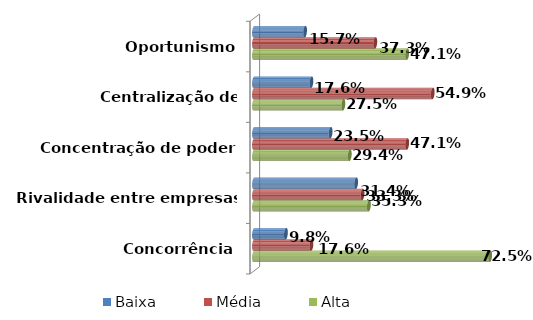
| Category | Baixa | Média | Alta |
|---|---|---|---|
| Oportunismo | 0.157 | 0.373 | 0.471 |
| Centralização de informações | 0.176 | 0.549 | 0.275 |
| Concentração de poder | 0.235 | 0.471 | 0.294 |
| Rivalidade entre empresas | 0.314 | 0.333 | 0.353 |
| Concorrência | 0.098 | 0.176 | 0.725 |